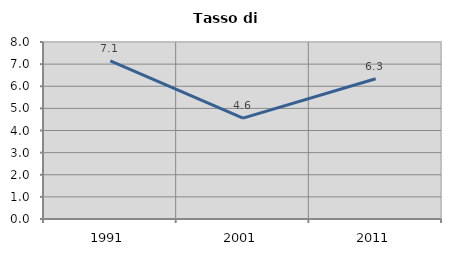
| Category | Tasso di disoccupazione   |
|---|---|
| 1991.0 | 7.143 |
| 2001.0 | 4.559 |
| 2011.0 | 6.34 |